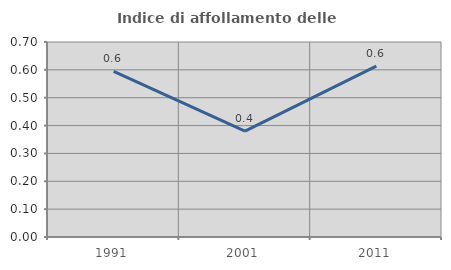
| Category | Indice di affollamento delle abitazioni  |
|---|---|
| 1991.0 | 0.594 |
| 2001.0 | 0.38 |
| 2011.0 | 0.613 |